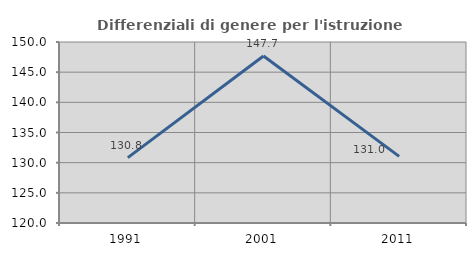
| Category | Differenziali di genere per l'istruzione superiore |
|---|---|
| 1991.0 | 130.828 |
| 2001.0 | 147.671 |
| 2011.0 | 131.045 |